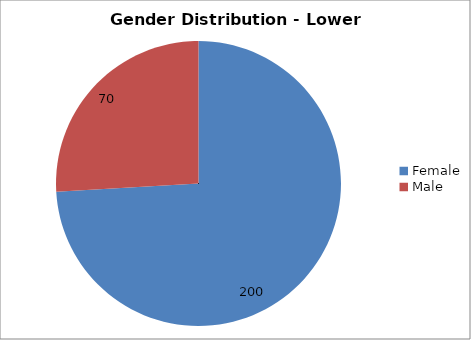
| Category | Series 1 | Series 0 |
|---|---|---|
| Female | 200 | 200 |
| Male | 70 | 70 |